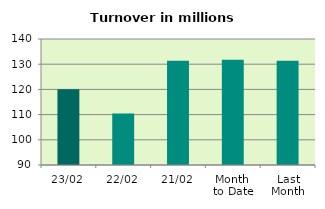
| Category | Series 0 |
|---|---|
| 23/02 | 120.052 |
| 22/02 | 110.448 |
| 21/02 | 131.337 |
| Month 
to Date | 131.803 |
| Last
Month | 131.402 |